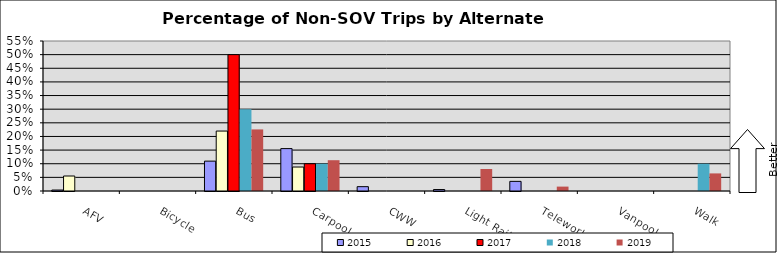
| Category | 2015 | 2016 | 2017 | 2018 | 2019 |
|---|---|---|---|---|---|
| AFV | 0.004 | 0.055 | 0 | 0 | 0 |
| Bicycle | 0 | 0 | 0 | 0 | 0 |
| Bus | 0.11 | 0.22 | 0.5 | 0.3 | 0.226 |
| Carpool | 0.155 | 0.088 | 0.1 | 0.1 | 0.113 |
| CWW | 0.016 | 0 | 0 | 0 | 0 |
| Light Rail | 0.005 | 0 | 0 | 0 | 0.081 |
| Telework | 0.035 | 0 | 0 | 0 | 0.016 |
| Vanpool | 0 | 0 | 0 | 0 | 0 |
| Walk | 0 | 0 | 0 | 0.1 | 0.065 |